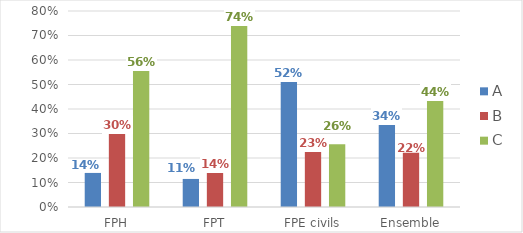
| Category | A | B | C |
|---|---|---|---|
| FPH | 0.139 | 0.301 | 0.56 |
| FPT | 0.115 | 0.143 | 0.743 |
| FPE civils | 0.516 | 0.228 | 0.256 |
| Ensemble | 0.34 | 0.222 | 0.438 |